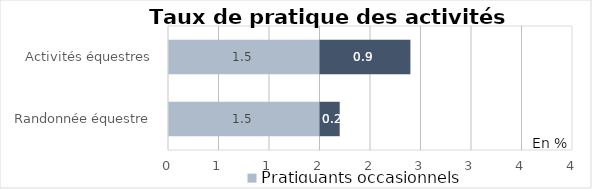
| Category | Pratiquants occasionnels | Pratiquants réguliers |
|---|---|---|
| Randonnée équestre | 1.5 | 0.2 |
| Activités équestres | 1.5 | 0.9 |